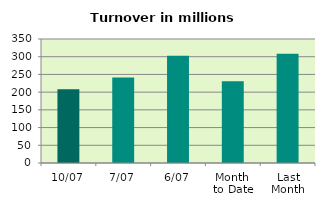
| Category | Series 0 |
|---|---|
| 10/07 | 207.852 |
| 7/07 | 241.535 |
| 6/07 | 302.463 |
| Month 
to Date | 230.461 |
| Last
Month | 308.534 |